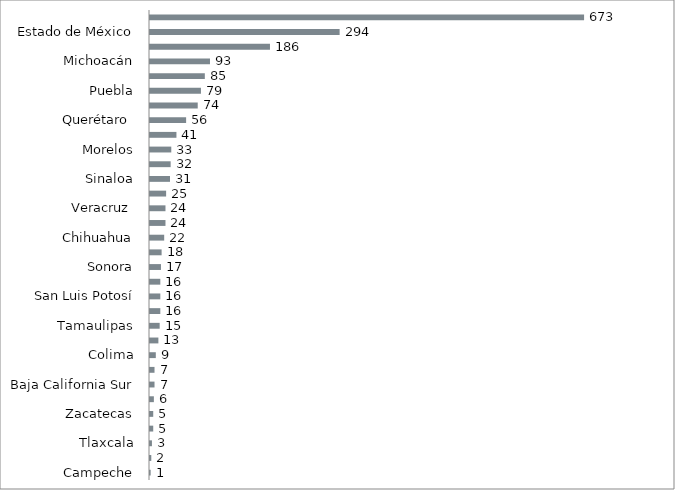
| Category | Series 0 |
|---|---|
| Campeche | 1 |
| Nayarit | 2 |
| Tlaxcala | 3 |
| Guerrero | 5 |
| Zacatecas | 5 |
| Chiapas | 6 |
| Baja California Sur | 7 |
| Durango | 7 |
| Colima | 9 |
| Tabasco | 13 |
| Tamaulipas | 15 |
| Quintana Roo | 16 |
| San Luis Potosí | 16 |
| Yucatán | 16 |
| Sonora | 17 |
| Aguascalientes | 18 |
| Chihuahua | 22 |
| Baja California | 24 |
| Veracruz  | 24 |
| Hidalgo | 25 |
| Sinaloa | 31 |
| Coahuila  | 32 |
| Morelos | 33 |
| Oaxaca | 41 |
| Querétaro  | 56 |
| Nuevo León | 74 |
| Puebla | 79 |
| Guanajuato | 85 |
| Michoacán | 93 |
| Jalisco | 186 |
| Estado de México | 294 |
| Ciudad de México | 673 |